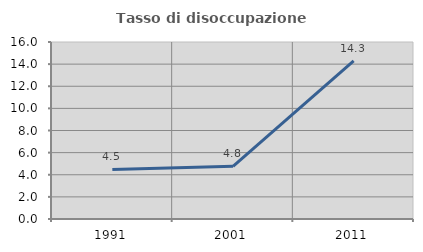
| Category | Tasso di disoccupazione giovanile  |
|---|---|
| 1991.0 | 4.478 |
| 2001.0 | 4.762 |
| 2011.0 | 14.286 |